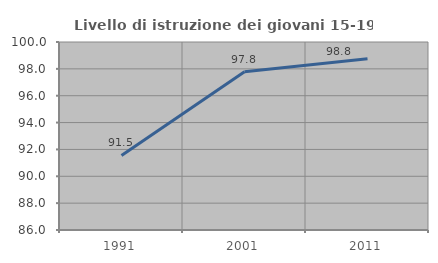
| Category | Livello di istruzione dei giovani 15-19 anni |
|---|---|
| 1991.0 | 91.549 |
| 2001.0 | 97.79 |
| 2011.0 | 98.758 |